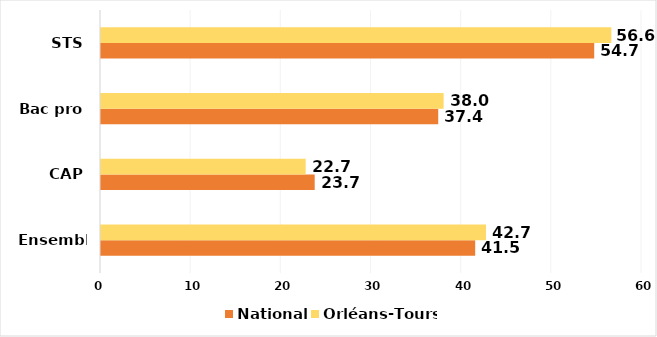
| Category | National | Orléans-Tours |
|---|---|---|
| Ensemble | 41.5 | 42.7 |
| CAP | 23.7 | 22.7 |
| Bac pro | 37.4 | 38 |
| STS | 54.7 | 56.6 |